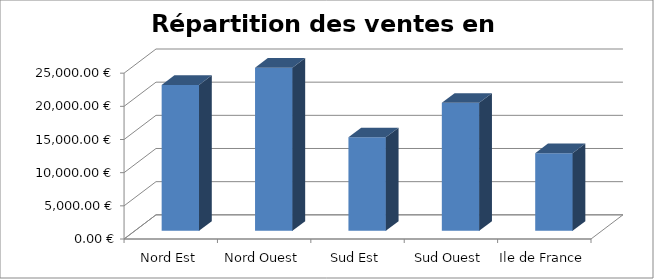
| Category | 2002 |
|---|---|
| Nord Est | 22000 |
| Nord Ouest | 24600 |
| Sud Est | 14100 |
| Sud Ouest | 19300 |
| Ile de France | 11700 |